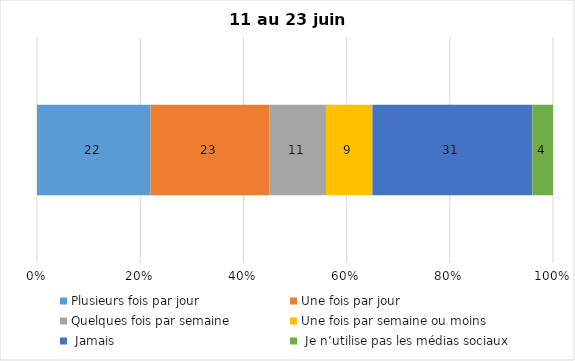
| Category | Plusieurs fois par jour | Une fois par jour | Quelques fois par semaine   | Une fois par semaine ou moins   |  Jamais   |  Je n’utilise pas les médias sociaux |
|---|---|---|---|---|---|---|
| 0 | 22 | 23 | 11 | 9 | 31 | 4 |